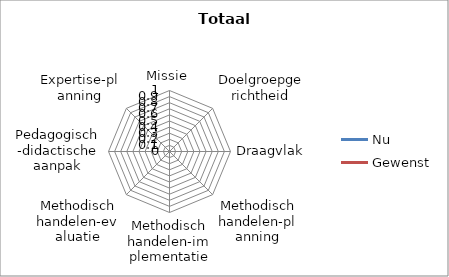
| Category | Nu | Gewenst |
|---|---|---|
| Missie | 0 | 0 |
| Doelgroepgerichtheid | 0 | 0 |
| Draagvlak | 0 | 0 |
| Methodisch handelen-planning | 0 | 0 |
| Methodisch handelen-implementatie | 0 | 0 |
| Methodisch handelen-evaluatie | 0 | 0 |
| Pedagogisch-didactische aanpak | 0 | 0 |
| Expertise-planning | 0 | 0 |